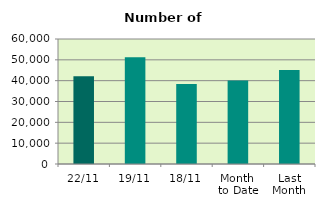
| Category | Series 0 |
|---|---|
| 22/11 | 42128 |
| 19/11 | 51200 |
| 18/11 | 38426 |
| Month 
to Date | 40021.375 |
| Last
Month | 45060.857 |